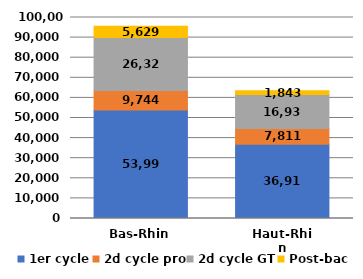
| Category | 1er cycle | 2d cycle pro | 2d cycle GT | Post-bac |
|---|---|---|---|---|
| Bas-Rhin | 53995 | 9744 | 26323 | 5629 |
| Haut-Rhin | 36917 | 7811 | 16934 | 1843 |